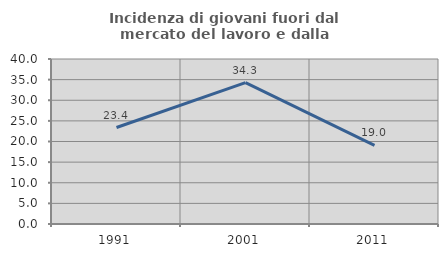
| Category | Incidenza di giovani fuori dal mercato del lavoro e dalla formazione  |
|---|---|
| 1991.0 | 23.39 |
| 2001.0 | 34.258 |
| 2011.0 | 19.048 |